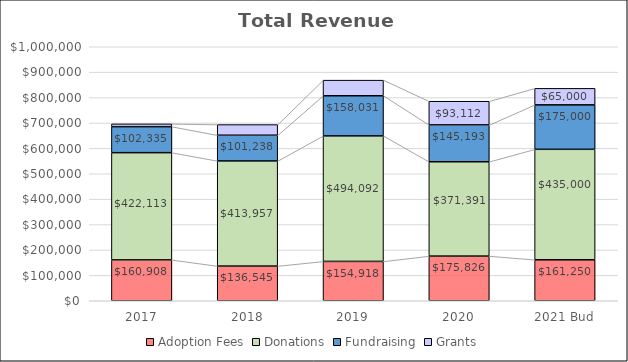
| Category | Adoption Fees | Donations | Fundraising | Grants |
|---|---|---|---|---|
| 2017 | 160908 | 422113 | 102335 | 11000 |
| 2018 | 136545 | 413956.9 | 101238 | 41900 |
| 2019 | 154918.05 | 494091.55 | 158031.07 | 61444.6 |
| 2020 | 175825.5 | 371390.84 | 145193.01 | 93111.68 |
| 2021 Bud | 161250 | 435000 | 175000 | 65000 |